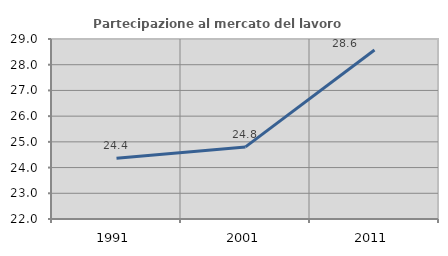
| Category | Partecipazione al mercato del lavoro  femminile |
|---|---|
| 1991.0 | 24.367 |
| 2001.0 | 24.803 |
| 2011.0 | 28.571 |